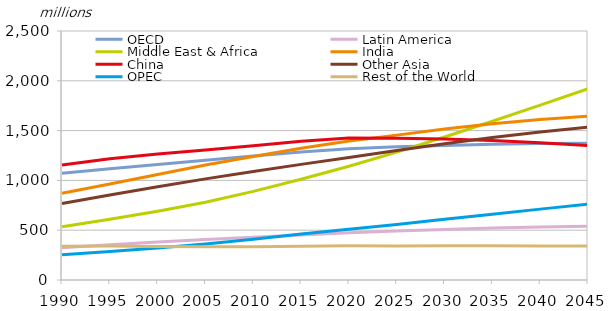
| Category | OECD | Latin America | Middle East & Africa | India | China | Other Asia | OPEC | Rest of the World |
|---|---|---|---|---|---|---|---|---|
| 1990.0 | 1071.737 | 324.171 | 535.272 | 870.452 | 1153.704 | 767.501 | 253.414 | 339.925 |
| 1995.0 | 1117.396 | 353.195 | 609.354 | 964.279 | 1218.144 | 852.59 | 286.565 | 341.695 |
| 2000.0 | 1159.107 | 380.992 | 689.839 | 1059.634 | 1264.099 | 936.074 | 321.626 | 337.528 |
| 2005.0 | 1201.251 | 405.835 | 781.199 | 1154.639 | 1304.888 | 1015.309 | 361.196 | 333.86 |
| 2010.0 | 1244.836 | 428.541 | 890.134 | 1240.614 | 1348.191 | 1088.445 | 410.1 | 334.743 |
| 2015.0 | 1285.586 | 450.996 | 1010.877 | 1322.867 | 1393.715 | 1160.897 | 461.953 | 339.707 |
| 2020.0 | 1318.4 | 474.745 | 1142.674 | 1396.387 | 1424.93 | 1230.298 | 509.435 | 344.084 |
| 2025.0 | 1336.857 | 491.641 | 1284.48 | 1454.607 | 1424.382 | 1300.396 | 558.118 | 341.509 |
| 2030.0 | 1351.354 | 507.805 | 1436.279 | 1514.994 | 1415.606 | 1368.02 | 609.343 | 342.741 |
| 2035.0 | 1363.064 | 521.628 | 1594.089 | 1567.802 | 1399.548 | 1430.151 | 660.477 | 342.638 |
| 2040.0 | 1370.035 | 532.701 | 1756.393 | 1611.676 | 1377.557 | 1485.893 | 711.512 | 342.483 |
| 2045.0 | 1372.134 | 540.782 | 1920.391 | 1645.863 | 1349.757 | 1534.609 | 761.713 | 342.294 |